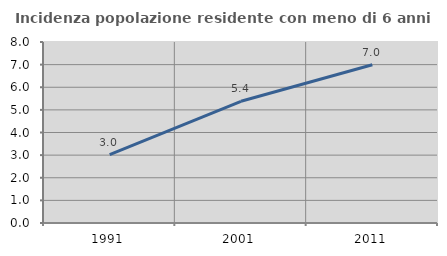
| Category | Incidenza popolazione residente con meno di 6 anni |
|---|---|
| 1991.0 | 3.024 |
| 2001.0 | 5.378 |
| 2011.0 | 6.992 |